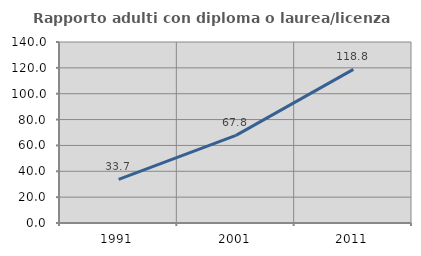
| Category | Rapporto adulti con diploma o laurea/licenza media  |
|---|---|
| 1991.0 | 33.684 |
| 2001.0 | 67.78 |
| 2011.0 | 118.803 |